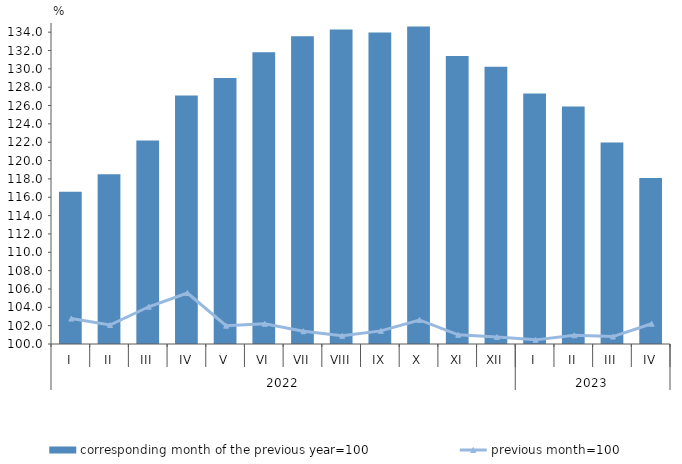
| Category | corresponding month of the previous year=100 |
|---|---|
| 0 | 116.6 |
| 1 | 118.5 |
| 2 | 122.2 |
| 3 | 127.1 |
| 4 | 129 |
| 5 | 131.8 |
| 6 | 133.55 |
| 7 | 134.29 |
| 8 | 133.97 |
| 9 | 134.62 |
| 10 | 131.4 |
| 11 | 130.24 |
| 12 | 127.307 |
| 13 | 125.905 |
| 14 | 121.977 |
| 15 | 118.102 |